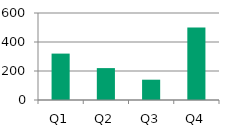
| Category | Umsatz Produkt A |
|---|---|
| Q1 | 320 |
| Q2 | 220 |
| Q3 | 140 |
| Q4 | 500 |